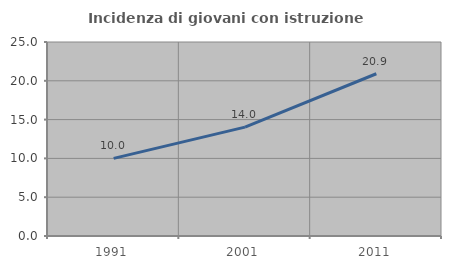
| Category | Incidenza di giovani con istruzione universitaria |
|---|---|
| 1991.0 | 10 |
| 2001.0 | 14.035 |
| 2011.0 | 20.908 |